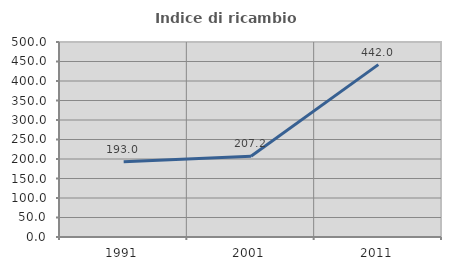
| Category | Indice di ricambio occupazionale  |
|---|---|
| 1991.0 | 193 |
| 2001.0 | 207.246 |
| 2011.0 | 442 |